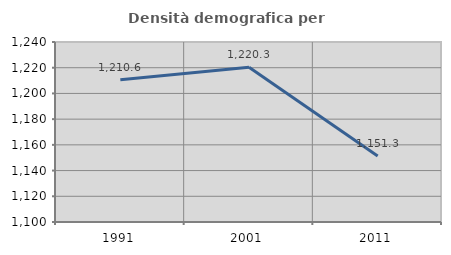
| Category | Densità demografica |
|---|---|
| 1991.0 | 1210.624 |
| 2001.0 | 1220.304 |
| 2011.0 | 1151.309 |